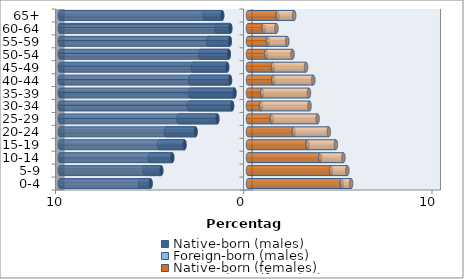
| Category | Native-born (males) | Foreign-born (males) | Native-born (females) | Foreign-born (females) |
|---|---|---|---|---|
| 0-4 | -5.178 | -0.537 | 4.977 | 0.502 |
| 5-9 | -4.608 | -0.883 | 4.412 | 0.867 |
| 10-14 | -4.028 | -1.189 | 3.838 | 1.232 |
| 15-19 | -3.376 | -1.347 | 3.163 | 1.507 |
| 20-24 | -2.788 | -1.574 | 2.425 | 1.868 |
| 25-29 | -1.631 | -2.059 | 1.257 | 2.442 |
| 30-34 | -0.847 | -2.288 | 0.687 | 2.58 |
| 35-39 | -0.721 | -2.35 | 0.75 | 2.488 |
| 40-44 | -0.957 | -2.115 | 1.346 | 2.125 |
| 45-49 | -1.109 | -1.826 | 1.323 | 1.761 |
| 50-54 | -1.022 | -1.52 | 0.96 | 1.407 |
| 55-59 | -0.97 | -1.135 | 1.058 | 1.03 |
| 60-64 | -0.943 | -0.731 | 0.834 | 0.678 |
| 65+ | -1.373 | -0.921 | 1.571 | 0.884 |